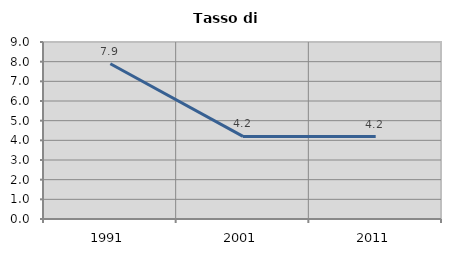
| Category | Tasso di disoccupazione   |
|---|---|
| 1991.0 | 7.895 |
| 2001.0 | 4.198 |
| 2011.0 | 4.194 |